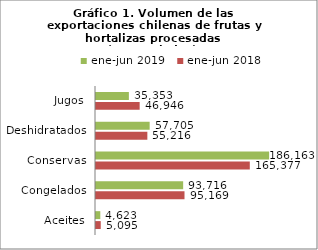
| Category | ene-jun 2018 | ene-jun 2019 |
|---|---|---|
| Aceites | 5094812.957 | 4622917.183 |
| Congelados | 95168594.902 | 93715647.736 |
| Conservas | 165376571.969 | 186162741.923 |
| Deshidratados | 55215651.437 | 57704619.66 |
| Jugos | 46945592.97 | 35353458.495 |